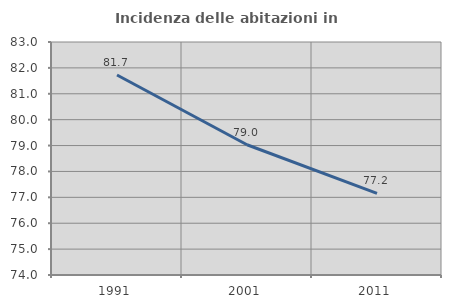
| Category | Incidenza delle abitazioni in proprietà  |
|---|---|
| 1991.0 | 81.727 |
| 2001.0 | 79.032 |
| 2011.0 | 77.155 |